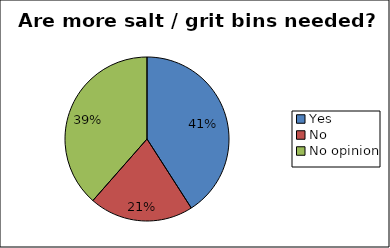
| Category | Series 0 |
|---|---|
| Yes | 0.409 |
| No | 0.206 |
| No opinion | 0.385 |